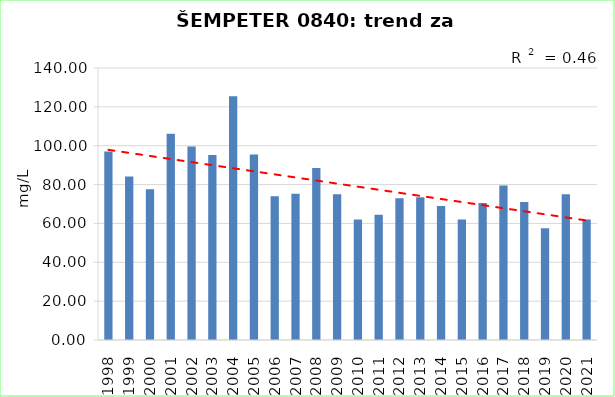
| Category | Vsota |
|---|---|
| 1998 | 97 |
| 1999 | 84.2 |
| 2000 | 77.6 |
| 2001 | 106.1 |
| 2002 | 99.65 |
| 2003 | 95.225 |
| 2004 | 125.467 |
| 2005 | 95.467 |
| 2006 | 74 |
| 2007 | 75.25 |
| 2008 | 88.5 |
| 2009 | 75 |
| 2010 | 62 |
| 2011 | 64.5 |
| 2012 | 73 |
| 2013 | 73.5 |
| 2014 | 69 |
| 2015 | 62 |
| 2016 | 70.5 |
| 2017 | 79.5 |
| 2018 | 71 |
| 2019 | 57.5 |
| 2020 | 75 |
| 2021 | 62 |